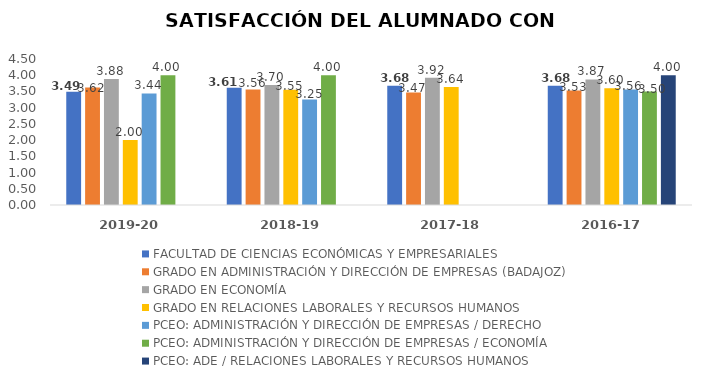
| Category | FACULTAD DE CIENCIAS ECONÓMICAS Y EMPRESARIALES | GRADO EN ADMINISTRACIÓN Y DIRECCIÓN DE EMPRESAS (BADAJOZ) | GRADO EN ECONOMÍA | GRADO EN RELACIONES LABORALES Y RECURSOS HUMANOS | PCEO: ADMINISTRACIÓN Y DIRECCIÓN DE EMPRESAS / DERECHO | PCEO: ADMINISTRACIÓN Y DIRECCIÓN DE EMPRESAS / ECONOMÍA | PCEO: ADE / RELACIONES LABORALES Y RECURSOS HUMANOS |
|---|---|---|---|---|---|---|---|
| 2019-20 | 3.49 | 3.62 | 3.88 | 2 | 3.44 | 4 | 0 |
| 2018-19 | 3.612 | 3.56 | 3.7 | 3.55 | 3.25 | 4 | 0 |
| 2017-18 | 3.677 | 3.47 | 3.92 | 3.64 | 0 | 0 | 0 |
| 2016-17 | 3.677 | 3.53 | 3.87 | 3.6 | 3.56 | 3.5 | 4 |